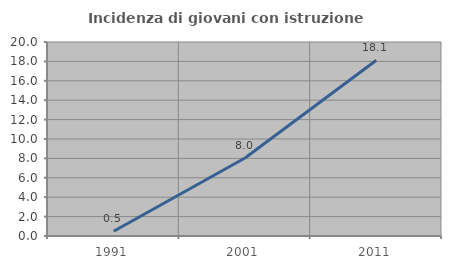
| Category | Incidenza di giovani con istruzione universitaria |
|---|---|
| 1991.0 | 0.495 |
| 2001.0 | 8.046 |
| 2011.0 | 18.121 |